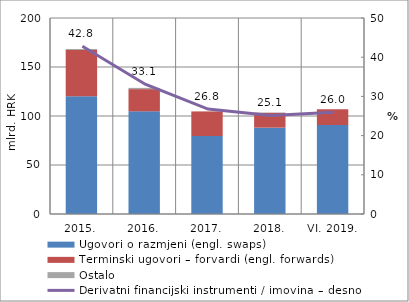
| Category | Ugovori o razmjeni (engl. swaps) | Terminski ugovori – forvardi (engl. forwards) | Ostalo |
|---|---|---|---|
| 2015. | 120.194 | 47.14 | 0.941 |
| 2016. | 104.771 | 22.663 | 1.263 |
| 2017. | 79.619 | 25.065 | 0.025 |
| 2018. | 88.09 | 15.156 | 0.324 |
| VI. 2019. | 90.909 | 15.902 | 0.117 |